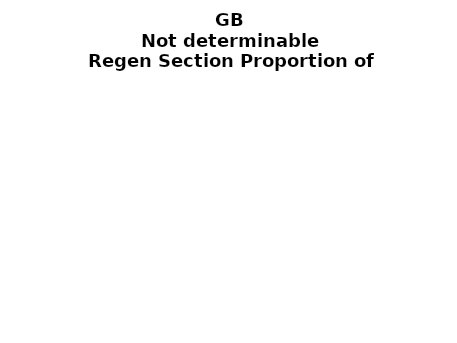
| Category | Not determinable |
|---|---|
| None | 0.006 |
| Seedlings only | 0 |
| Seedlings, saplings only | 0 |
| Seedlings, saplings, <7 cm trees | 0 |
| Saplings only | 0 |
| <7 cm trees, seedlings only | 0 |
| <7 cm trees, saplings only | 0 |
| <7 cm Trees only | 0 |